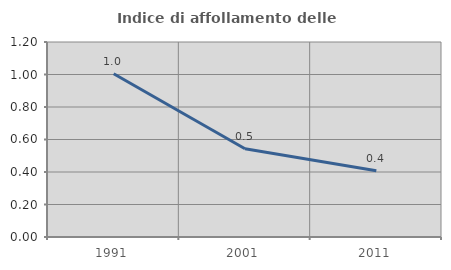
| Category | Indice di affollamento delle abitazioni  |
|---|---|
| 1991.0 | 1.005 |
| 2001.0 | 0.543 |
| 2011.0 | 0.407 |